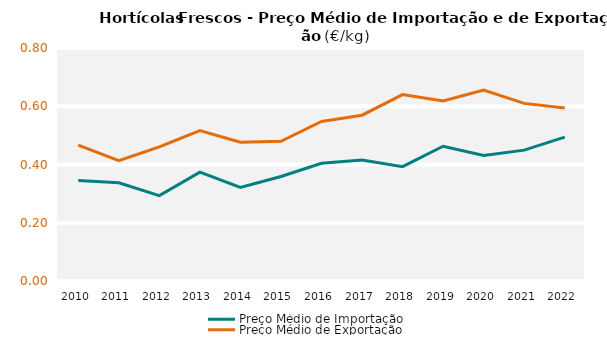
| Category | Preço Médio de Importação | Preço Médio de Exportação |
|---|---|---|
| 2010.0 | 0.345 | 0.466 |
| 2011.0 | 0.337 | 0.413 |
| 2012.0 | 0.293 | 0.46 |
| 2013.0 | 0.374 | 0.517 |
| 2014.0 | 0.322 | 0.477 |
| 2015.0 | 0.359 | 0.48 |
| 2016.0 | 0.404 | 0.548 |
| 2017.0 | 0.415 | 0.569 |
| 2018.0 | 0.393 | 0.64 |
| 2019.0 | 0.463 | 0.618 |
| 2020.0 | 0.431 | 0.655 |
| 2021.0 | 0.449 | 0.61 |
| 2022.0 | 0.494 | 0.594 |